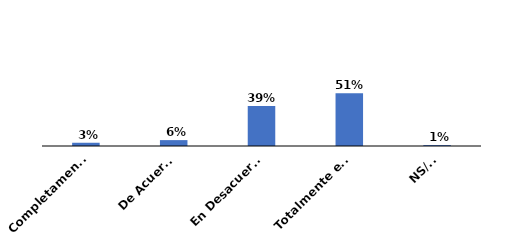
| Category | Series 0 |
|---|---|
| Completamente de acuerdo | 0.032 |
| De Acuerdo | 0.057 |
| En Desacuerdo | 0.389 |
| Totalmente en desacuerdo | 0.513 |
| NS/NR | 0.009 |